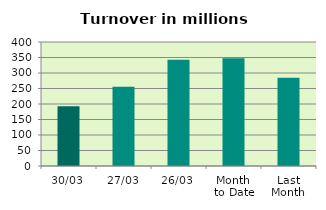
| Category | Series 0 |
|---|---|
| 30/03 | 192.923 |
| 27/03 | 255.312 |
| 26/03 | 343.129 |
| Month 
to Date | 347.943 |
| Last
Month | 285.08 |